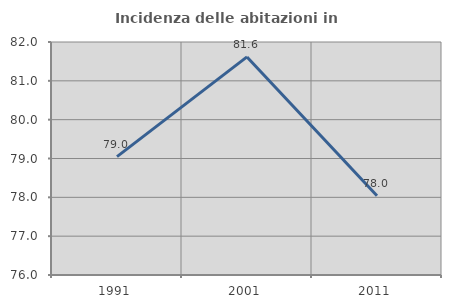
| Category | Incidenza delle abitazioni in proprietà  |
|---|---|
| 1991.0 | 79.048 |
| 2001.0 | 81.616 |
| 2011.0 | 78.043 |